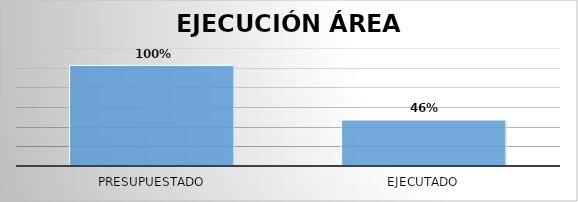
| Category | Series 0 |
|---|---|
| Presupuestado | 25578480391 |
| Ejecutado | 11687748771 |